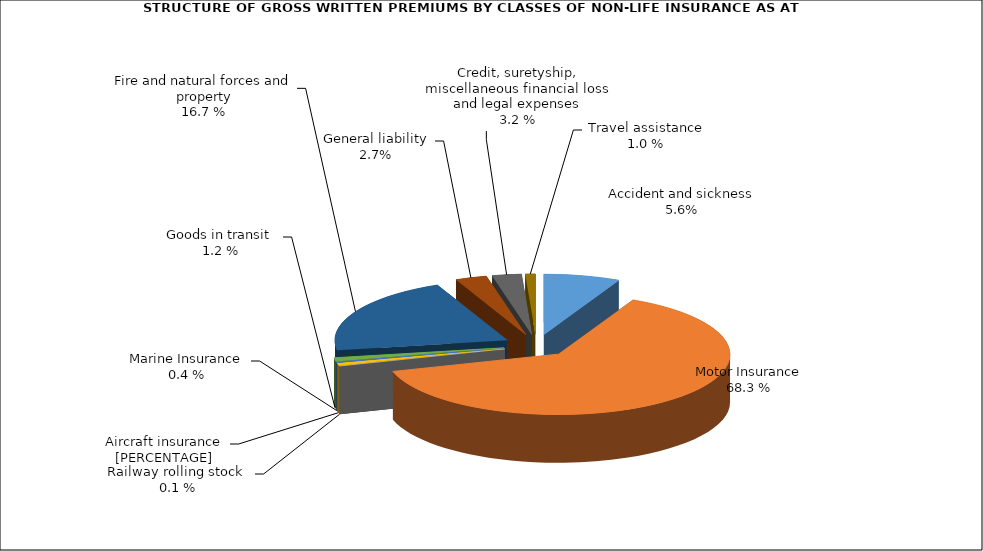
| Category | Злополука и заболяване МПС Релсови превозни средства Летателни апарати Плаванелни съдове Товари по време на превоз Пожар и природни бедствия и други щети на имущество Обща гражданска отговорност Кредити, гаранции, разни финансови загуби и правни разноски |
|---|---|
| Злополука и заболяване | 0.072 |
| МПС | 0.632 |
| Релсови превозни средства | 0 |
| Летателни апарати | 0.007 |
| Плаванелни съдове | 0.003 |
| Товари по време на превоз | 0.01 |
| Пожар и природни бедствия и други щети на имущество | 0.21 |
| Обща гражданска отговорност | 0.03 |
| Кредити, гаранции, разни финансови загуби и правни разноски | 0.027 |
| Помощ при пътуване | 0.009 |